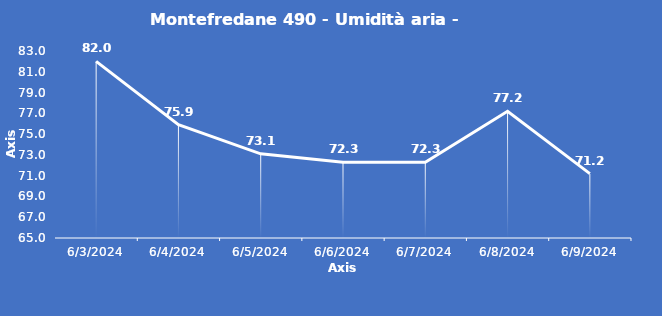
| Category | Montefredane 490 - Umidità aria - Grezzo (%) |
|---|---|
| 6/3/24 | 82 |
| 6/4/24 | 75.9 |
| 6/5/24 | 73.1 |
| 6/6/24 | 72.3 |
| 6/7/24 | 72.3 |
| 6/8/24 | 77.2 |
| 6/9/24 | 71.2 |